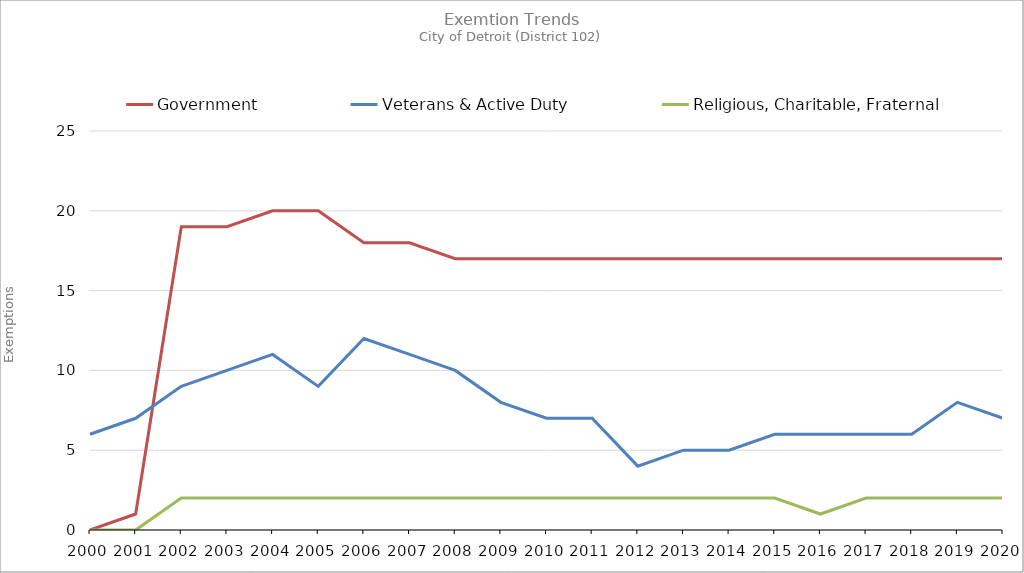
| Category | Government | Veterans & Active Duty | Religious, Charitable, Fraternal |
|---|---|---|---|
| 2000.0 | 0 | 6 | 0 |
| 2001.0 | 1 | 7 | 0 |
| 2002.0 | 19 | 9 | 2 |
| 2003.0 | 19 | 10 | 2 |
| 2004.0 | 20 | 11 | 2 |
| 2005.0 | 20 | 9 | 2 |
| 2006.0 | 18 | 12 | 2 |
| 2007.0 | 18 | 11 | 2 |
| 2008.0 | 17 | 10 | 2 |
| 2009.0 | 17 | 8 | 2 |
| 2010.0 | 17 | 7 | 2 |
| 2011.0 | 17 | 7 | 2 |
| 2012.0 | 17 | 4 | 2 |
| 2013.0 | 17 | 5 | 2 |
| 2014.0 | 17 | 5 | 2 |
| 2015.0 | 17 | 6 | 2 |
| 2016.0 | 17 | 6 | 1 |
| 2017.0 | 17 | 6 | 2 |
| 2018.0 | 17 | 6 | 2 |
| 2019.0 | 17 | 8 | 2 |
| 2020.0 | 17 | 7 | 2 |